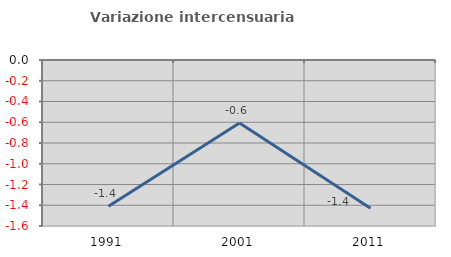
| Category | Variazione intercensuaria annua |
|---|---|
| 1991.0 | -1.409 |
| 2001.0 | -0.608 |
| 2011.0 | -1.429 |